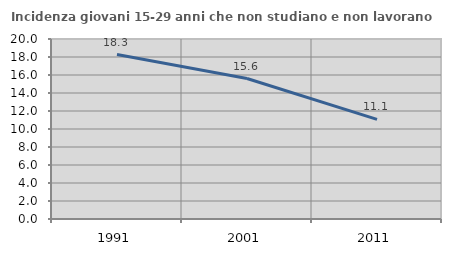
| Category | Incidenza giovani 15-29 anni che non studiano e non lavorano  |
|---|---|
| 1991.0 | 18.267 |
| 2001.0 | 15.608 |
| 2011.0 | 11.071 |